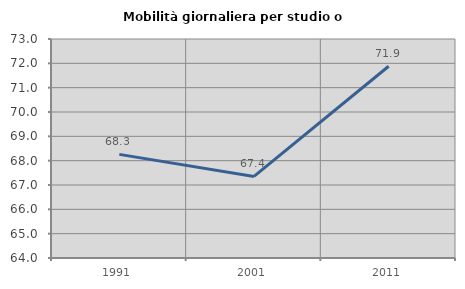
| Category | Mobilità giornaliera per studio o lavoro |
|---|---|
| 1991.0 | 68.258 |
| 2001.0 | 67.352 |
| 2011.0 | 71.881 |